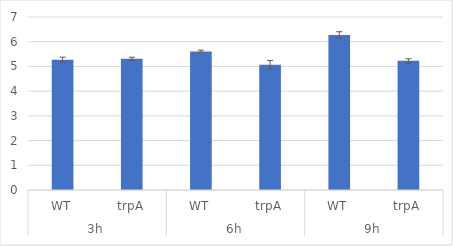
| Category | Series 0 |
|---|---|
| 0 | 5.274 |
| 1 | 5.309 |
| 2 | 5.609 |
| 3 | 5.07 |
| 4 | 6.275 |
| 5 | 5.225 |